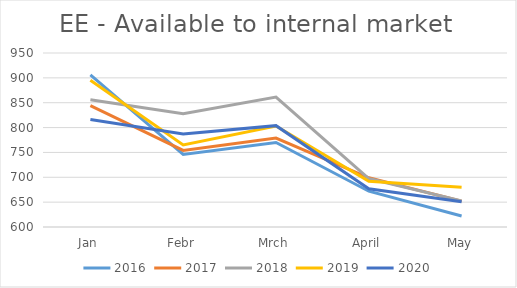
| Category | 2016 | 2017 | 2018 | 2019 | 2020 |
|---|---|---|---|---|---|
| Jan | 906 | 844 | 856 | 895 | 816.267 |
| Febr | 746 | 754 | 828 | 765 | 787.275 |
| Mrch | 770 | 779 | 861.2 | 803 | 803.89 |
| April | 672 | 699 | 697.5 | 691.8 | 676.979 |
| May | 622 | 652 | 652.543 | 679.879 | 650.645 |